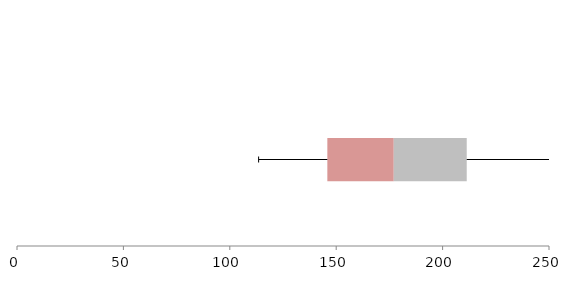
| Category | Series 1 | Series 2 | Series 3 |
|---|---|---|---|
| 0 | 145.838 | 31.21 | 34.293 |